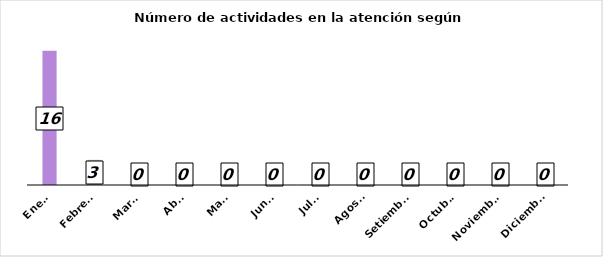
| Category | Series 0 |
|---|---|
| Enero | 16 |
| Febrero | 3 |
| Marzo | 0 |
| Abril | 0 |
| Mayo | 0 |
| Junio | 0 |
| Julio | 0 |
| Agosto | 0 |
| Setiembre | 0 |
| Octubre | 0 |
| Noviembre | 0 |
| Diciembre | 0 |